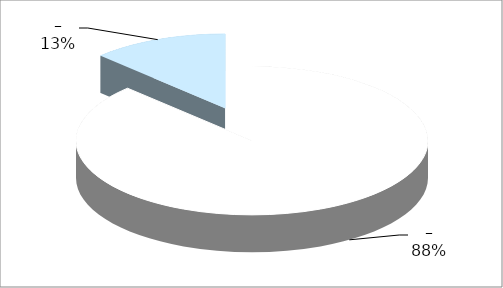
| Category | Series 0 |
|---|---|
| 0 | 7 |
| 1 | 1 |